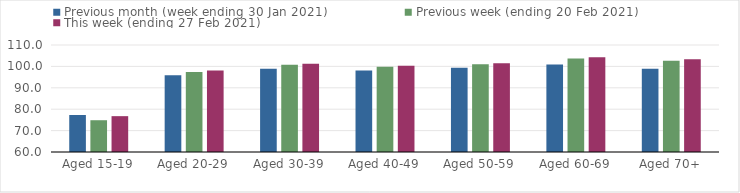
| Category | Previous month (week ending 30 Jan 2021) | Previous week (ending 20 Feb 2021) | This week (ending 27 Feb 2021) |
|---|---|---|---|
| Aged 15-19 | 77.3 | 74.85 | 76.75 |
| Aged 20-29 | 95.87 | 97.34 | 98.03 |
| Aged 30-39 | 98.95 | 100.78 | 101.24 |
| Aged 40-49 | 98.08 | 99.81 | 100.3 |
| Aged 50-59 | 99.39 | 100.97 | 101.47 |
| Aged 60-69 | 100.92 | 103.68 | 104.24 |
| Aged 70+ | 98.89 | 102.67 | 103.33 |